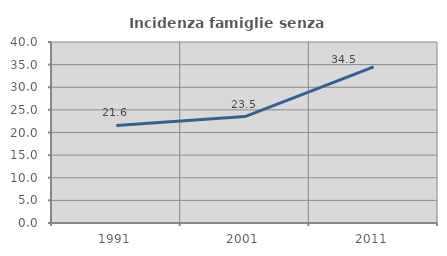
| Category | Incidenza famiglie senza nuclei |
|---|---|
| 1991.0 | 21.555 |
| 2001.0 | 23.512 |
| 2011.0 | 34.49 |